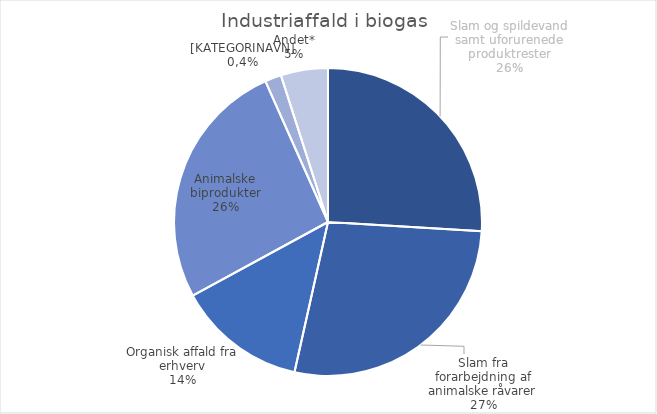
| Category | Series 0 |
|---|---|
| Slam og spildevand samt uforurenede produktrester | 243806.93 |
| Slam fra forarbejdning af animalske råvarer | 258613.73 |
| Organisk affald fra erhverv | 127540.39 |
| Animalske biprodukter | 246698.36 |
| Slam fra dambrug | 16106.002 |
| Andet* | 46443.36 |